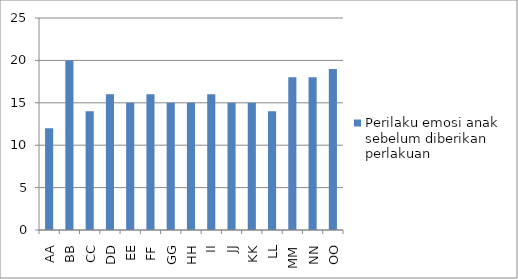
| Category | Perilaku emosi anak sebelum diberikan perlakuan |
|---|---|
| AA | 12 |
| BB | 20 |
| CC | 14 |
| DD | 16 |
| EE | 15 |
| FF | 16 |
| GG | 15 |
| HH | 15 |
| II | 16 |
| JJ | 15 |
| KK | 15 |
| LL | 14 |
| MM | 18 |
| NN | 18 |
| OO | 19 |